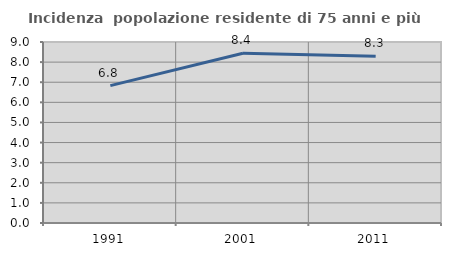
| Category | Incidenza  popolazione residente di 75 anni e più |
|---|---|
| 1991.0 | 6.831 |
| 2001.0 | 8.443 |
| 2011.0 | 8.297 |